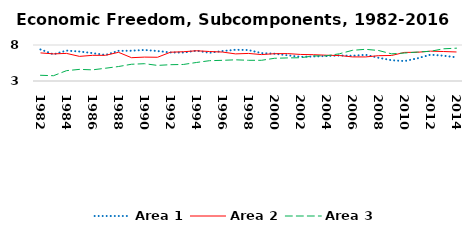
| Category | Area 1 | Area 2 | Area 3 |
|---|---|---|---|
| 1982.0 | 7.381 | 6.903 | 3.795 |
| 1983.0 | 6.703 | 6.767 | 3.734 |
| 1984.0 | 7.225 | 6.834 | 4.437 |
| 1985.0 | 7.093 | 6.419 | 4.615 |
| 1986.0 | 6.875 | 6.564 | 4.548 |
| 1987.0 | 6.618 | 6.568 | 4.774 |
| 1988.0 | 7.185 | 6.984 | 5.01 |
| 1989.0 | 7.206 | 6.236 | 5.325 |
| 1990.0 | 7.312 | 6.319 | 5.404 |
| 1991.0 | 7.166 | 6.295 | 5.166 |
| 1992.0 | 6.96 | 6.999 | 5.265 |
| 1993.0 | 6.955 | 7.065 | 5.298 |
| 1994.0 | 7.212 | 7.199 | 5.573 |
| 1995.0 | 6.916 | 7.096 | 5.82 |
| 1996.0 | 7.159 | 7.019 | 5.871 |
| 1997.0 | 7.34 | 6.765 | 5.942 |
| 1998.0 | 7.295 | 6.83 | 5.875 |
| 1999.0 | 6.873 | 6.67 | 5.875 |
| 2000.0 | 6.79 | 6.792 | 6.155 |
| 2001.0 | 6.569 | 6.807 | 6.204 |
| 2002.0 | 6.349 | 6.688 | 6.232 |
| 2003.0 | 6.408 | 6.652 | 6.481 |
| 2004.0 | 6.467 | 6.581 | 6.498 |
| 2005.0 | 6.547 | 6.539 | 6.785 |
| 2006.0 | 6.503 | 6.348 | 7.26 |
| 2007.0 | 6.643 | 6.343 | 7.401 |
| 2008.0 | 6.226 | 6.517 | 7.236 |
| 2009.0 | 5.888 | 6.543 | 6.773 |
| 2010.0 | 5.77 | 6.97 | 6.885 |
| 2011.0 | 6.153 | 6.992 | 7.022 |
| 2012.0 | 6.652 | 7.146 | 7.128 |
| 2013.0 | 6.514 | 7.095 | 7.471 |
| 2014.0 | 6.286 | 7.031 | 7.558 |